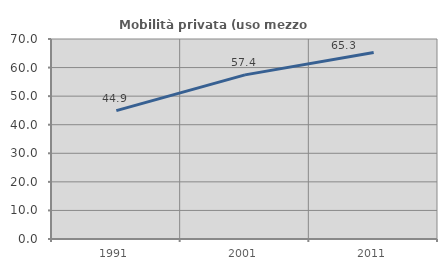
| Category | Mobilità privata (uso mezzo privato) |
|---|---|
| 1991.0 | 44.933 |
| 2001.0 | 57.447 |
| 2011.0 | 65.262 |